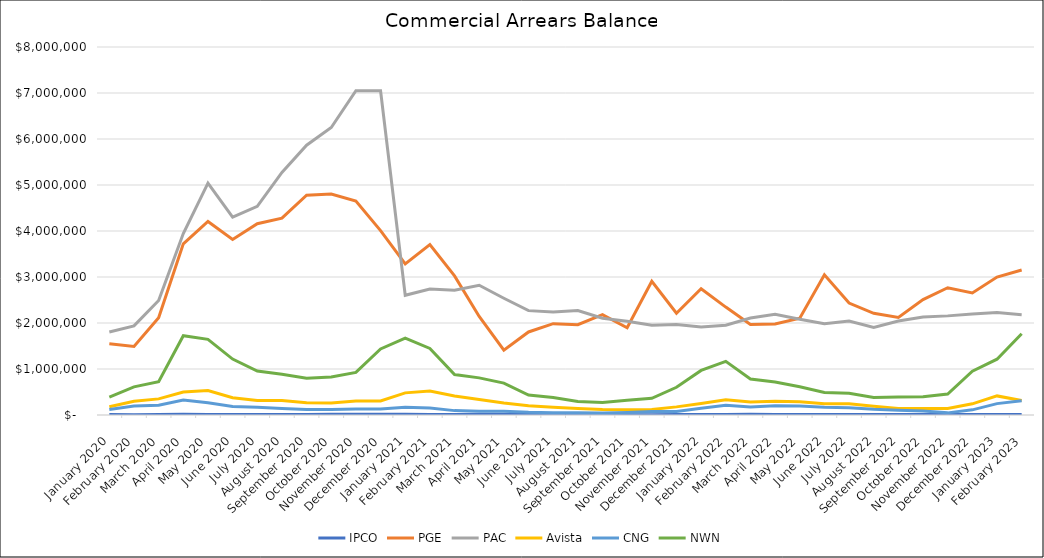
| Category | IPCO | PGE | PAC | Avista | CNG | NWN |
|---|---|---|---|---|---|---|
| 2020-01-01 | 8557.9 | 1546813.94 | 1803553.44 | 180967.3 | 119561.11 | 390844.84 |
| 2020-02-01 | 6581.76 | 1488683.79 | 1937044.24 | 297913.54 | 194607.94 | 611172.87 |
| 2020-03-01 | 10327.07 | 2113372.62 | 2490275.7 | 350643.09 | 214116.55 | 725017.24 |
| 2020-04-01 | 16279.83 | 3720869.94 | 3945522.92 | 500786.44 | 324905.52 | 1724474.42 |
| 2020-05-01 | 12666.29 | 4206875.38 | 5040564.49 | 530990.77 | 266825.84 | 1643678.28 |
| 2020-06-01 | 12492.21 | 3815231.03 | 4299918.25 | 375529.86 | 183388.46 | 1216116.8 |
| 2020-07-01 | 10745.05 | 4158353.32 | 4534553.44 | 315969.12 | 168915.86 | 954228.34 |
| 2020-08-01 | 11329.32 | 4279939.07 | 5273617.68 | 316096.18 | 139556.11 | 884212.26 |
| 2020-09-01 | 11863.4 | 4776788.79 | 5866053.11 | 268282.23 | 117208.35 | 801501.35 |
| 2020-10-01 | 15608.49 | 4803230.32 | 6250215.94 | 262685.21 | 118584.77 | 826093 |
| 2020-11-01 | 17655.84 | 4650793.16 | 7049596.56 | 305987.47 | 132900.81 | 926200 |
| 2020-12-01 | 17028.61 | 4008137 | 7049596.56 | 306281 | 131580.68 | 1436232 |
| 2021-01-01 | 15373 | 3286559 | 2602437.03 | 481243.08 | 169377 | 1670350 |
| 2021-02-01 | 12822.12 | 3706025 | 2739693 | 523673.55 | 149676.58 | 1446378 |
| 2021-03-01 | 11636.04 | 3024223.54 | 2712048 | 412634.62 | 95134.77 | 879426 |
| 2021-04-01 | 15837.77 | 2141434.99 | 2819830 | 338175.19 | 79791.88 | 807314 |
| 2021-05-01 | 16001.71 | 1408010.2 | 2538517 | 259740.6 | 82750.85 | 694259.14 |
| 2021-06-01 | 11006.43 | 1805096.81 | 2269014 | 200083.76 | 58618.45 | 432330.15 |
| 2021-07-01 | 11929.86 | 1984740.52 | 2239092 | 170990.11 | 48034.18 | 380726 |
| 2021-08-01 | 10617.24 | 1962498.12 | 2269014 | 141529.41 | 47967.68 | 295904.35 |
| 2021-09-01 | 8332.29 | 2180297.87 | 2104131 | 118349.61 | 45890.09 | 269741 |
| 2021-10-01 | 4915.58 | 1896650.29 | 2038756 | 115499.84 | 56001.38 | 321465.06 |
| 2021-11-01 | 6020.47 | 2905099.95 | 1952239 | 118450.71 | 73731.46 | 362564.75 |
| 2021-12-01 | 11170.11 | 2212898.17 | 1964810 | 176821.54 | 78154.82 | 602561.59 |
| 2022-01-01 | 10705.08 | 2744526.34 | 1912909 | 248297.52 | 145222.6 | 968614.45 |
| 2022-02-01 | 11870.65 | 2346081.13 | 1952533 | 331028.37 | 210300.18 | 1166018.54 |
| 2022-03-01 | 14094.01 | 1968583 | 2107327 | 282020 | 174195.39 | 783046.91 |
| 2022-04-01 | 10843.02 | 1978436.02 | 2188257 | 299118.62 | 202360.82 | 718261.76 |
| 2022-05-01 | 13321.65 | 2104310.04 | 2081006 | 288966.63 | 198015.89 | 612638 |
| 2022-06-01 | 9744.21 | 3046074.31 | 1982777 | 243539.05 | 170658.1 | 491133 |
| 2022-07-01 | 11470.11 | 2433869.18 | 2041566 | 243285.09 | 159023.51 | 471585.77 |
| 2022-08-01 | 10433.53 | 2210686.89 | 1904597 | 189446.34 | 125078.88 | 382055.06 |
| 2022-09-01 | 12376.49 | 2120573.12 | 2041566 | 139498.48 | 104578.02 | 389644.15 |
| 2022-10-01 | 13183.66 | 2508718.63 | 2130806 | 142911.08 | 88679.5 | 397260.41 |
| 2022-11-01 | 12003.06 | 2766908.8 | 2154880 | 143030.4 | 46358.9 | 456758.56 |
| 2022-12-01 | 9593.27 | 2653055.01 | 2197853 | 243241.58 | 111737.3 | 950905.51 |
| 2023-01-01 | 10457.56 | 2999803.98 | 2226604 | 415164.56 | 247458.24 | 1212770.58 |
| 2023-02-01 | 10712.12 | 3153230.44 | 2181281 | 315932.53 | 307798.11 | 1766410.92 |